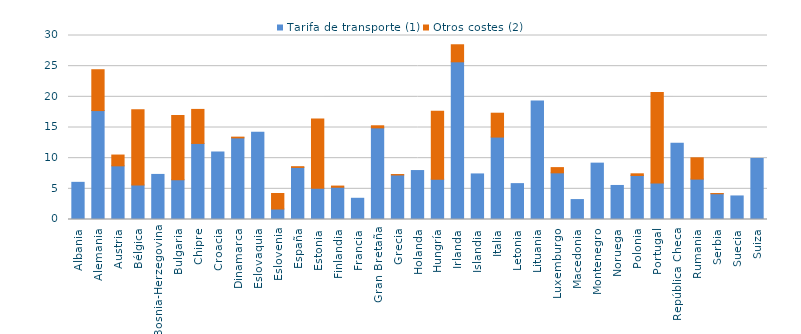
| Category | Tarifa de transporte (1) | Otros costes (2) |
|---|---|---|
| Albania | 6.06 | 0 |
| Alemania | 17.76 | 6.66 |
| Austria | 8.75 | 1.76 |
| Bélgica | 5.62 | 12.27 |
| Bosnia-Herzegovina | 7.35 | 0 |
| Bulgaria | 6.48 | 10.49 |
| Chipre | 12.4 | 5.55 |
| Croacia | 10.99 | 0 |
| Dinamarca | 13.31 | 0.12 |
| Eslovaquia | 14.22 | 0 |
| Eslovenia | 1.71 | 2.53 |
| España | 8.49 | 0.12 |
| Estonia | 5.09 | 11.3 |
| Finlandia | 5.26 | 0.19 |
| Francia | 3.46 | 0 |
| Gran Bretaña | 14.94 | 0.34 |
| Grecia | 7.26 | 0.07 |
| Holanda | 7.98 | 0 |
| Hungría | 6.57 | 11.06 |
| Irlanda | 25.71 | 2.78 |
| Islandia | 7.43 | 0 |
| Italia | 13.44 | 3.89 |
| Letonia | 5.85 | 0 |
| Lituania | 19.33 | 0 |
| Luxemburgo | 7.61 | 0.85 |
| Macedonia | 3.25 | 0 |
| Montenegro | 9.19 | 0 |
| Noruega | 5.55 | 0 |
| Polonia | 7.18 | 0.27 |
| Portugal | 5.94 | 14.78 |
| República Checa | 12.45 | 0 |
| Rumania | 6.59 | 3.47 |
| Serbia | 4.2 | 0.03 |
| Suecia | 3.84 | 0 |
| Suiza | 9.95 | 0 |